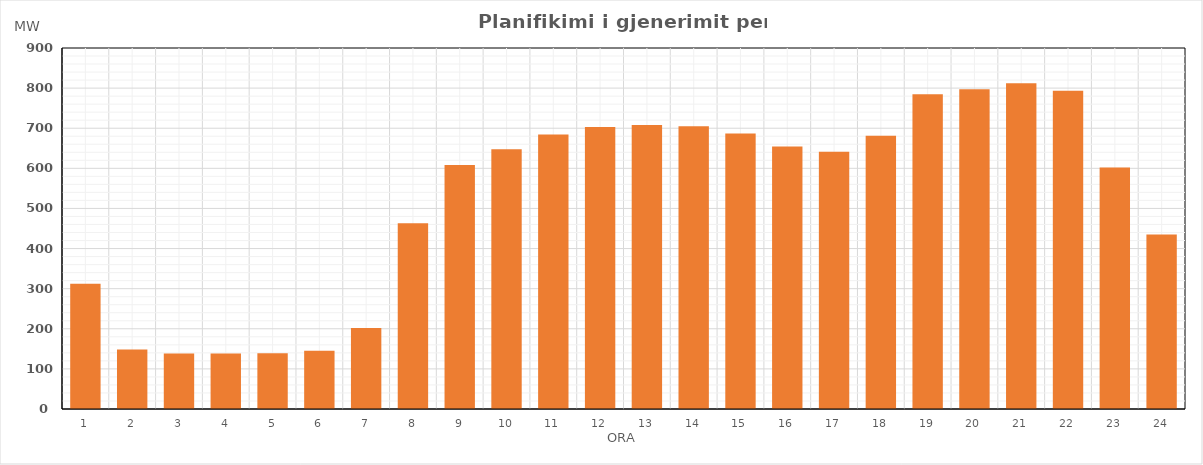
| Category | Max (MW) |
|---|---|
| 0 | 312 |
| 1 | 148.22 |
| 2 | 138.21 |
| 3 | 138.21 |
| 4 | 139.21 |
| 5 | 144.92 |
| 6 | 202.206 |
| 7 | 463.014 |
| 8 | 608 |
| 9 | 647.345 |
| 10 | 684.637 |
| 11 | 702.918 |
| 12 | 707.825 |
| 13 | 704.761 |
| 14 | 686.649 |
| 15 | 654.423 |
| 16 | 641.309 |
| 17 | 681.51 |
| 18 | 785 |
| 19 | 797 |
| 20 | 812 |
| 21 | 793.702 |
| 22 | 601.951 |
| 23 | 435.127 |